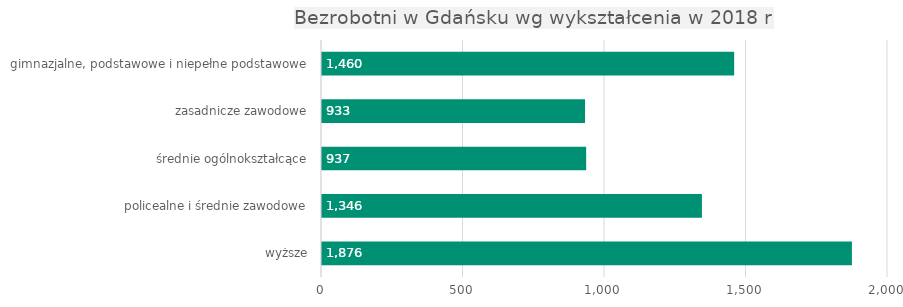
| Category | Series 0 |
|---|---|
| wyższe | 1876 |
| policealne i średnie zawodowe | 1346 |
| średnie ogólnokształcące | 937 |
| zasadnicze zawodowe | 933 |
| gimnazjalne, podstawowe i niepełne podstawowe | 1460 |